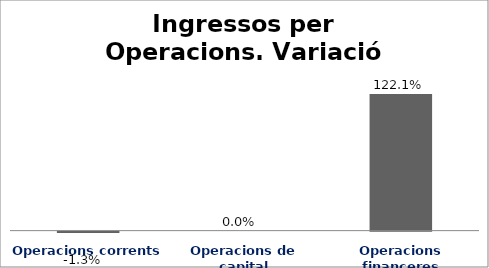
| Category | Series 0 |
|---|---|
| Operacions corrents | -0.013 |
| Operacions de capital | 0 |
| Operacions financeres | 1.221 |